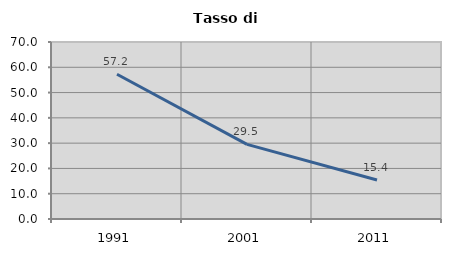
| Category | Tasso di disoccupazione   |
|---|---|
| 1991.0 | 57.247 |
| 2001.0 | 29.527 |
| 2011.0 | 15.431 |